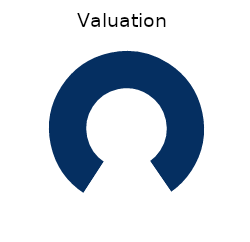
| Category | Valuation |
|---|---|
| 0 | 130 |
| 1 | 0 |
| 2 | 30 |